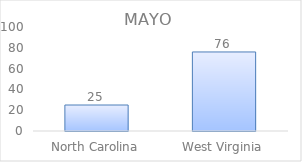
| Category | Series 0 |
|---|---|
| North Carolina | 25 |
| West Virginia | 76 |